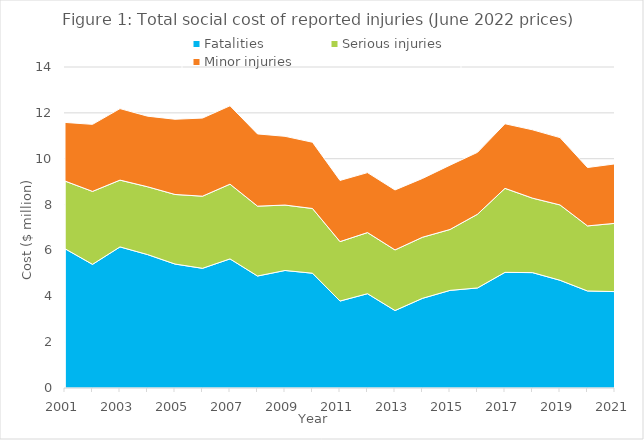
| Category | Fatalities | Serious injuries | Minor injuries |
|---|---|---|---|
| 2001.0 | 6.074 | 2.952 | 2.558 |
| 2002.0 | 5.393 | 3.181 | 2.924 |
| 2003.0 | 6.154 | 2.912 | 3.119 |
| 2004.0 | 5.82 | 2.957 | 3.078 |
| 2005.0 | 5.406 | 3.035 | 3.28 |
| 2006.0 | 5.22 | 3.146 | 3.407 |
| 2007.0 | 5.631 | 3.26 | 3.417 |
| 2008.0 | 4.884 | 3.047 | 3.15 |
| 2009.0 | 5.126 | 2.853 | 2.998 |
| 2010.0 | 5.007 | 2.822 | 2.89 |
| 2011.0 | 3.793 | 2.592 | 2.668 |
| 2012.0 | 4.113 | 2.665 | 2.615 |
| 2013.0 | 3.378 | 2.644 | 2.616 |
| 2014.0 | 3.912 | 2.664 | 2.564 |
| 2015.0 | 4.258 | 2.657 | 2.805 |
| 2016.0 | 4.364 | 3.215 | 2.7 |
| 2017.0 | 5.044 | 3.664 | 2.817 |
| 2018.0 | 5.032 | 3.249 | 2.98 |
| 2019.0 | 4.699 | 3.286 | 2.935 |
| 2020.0 | 4.232 | 2.838 | 2.546 |
| 2021.0 | 4.205 | 2.977 | 2.592 |